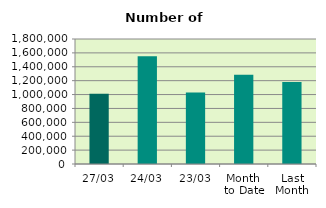
| Category | Series 0 |
|---|---|
| 27/03 | 1013170 |
| 24/03 | 1553234 |
| 23/03 | 1031204 |
| Month 
to Date | 1286936.421 |
| Last
Month | 1180310.4 |